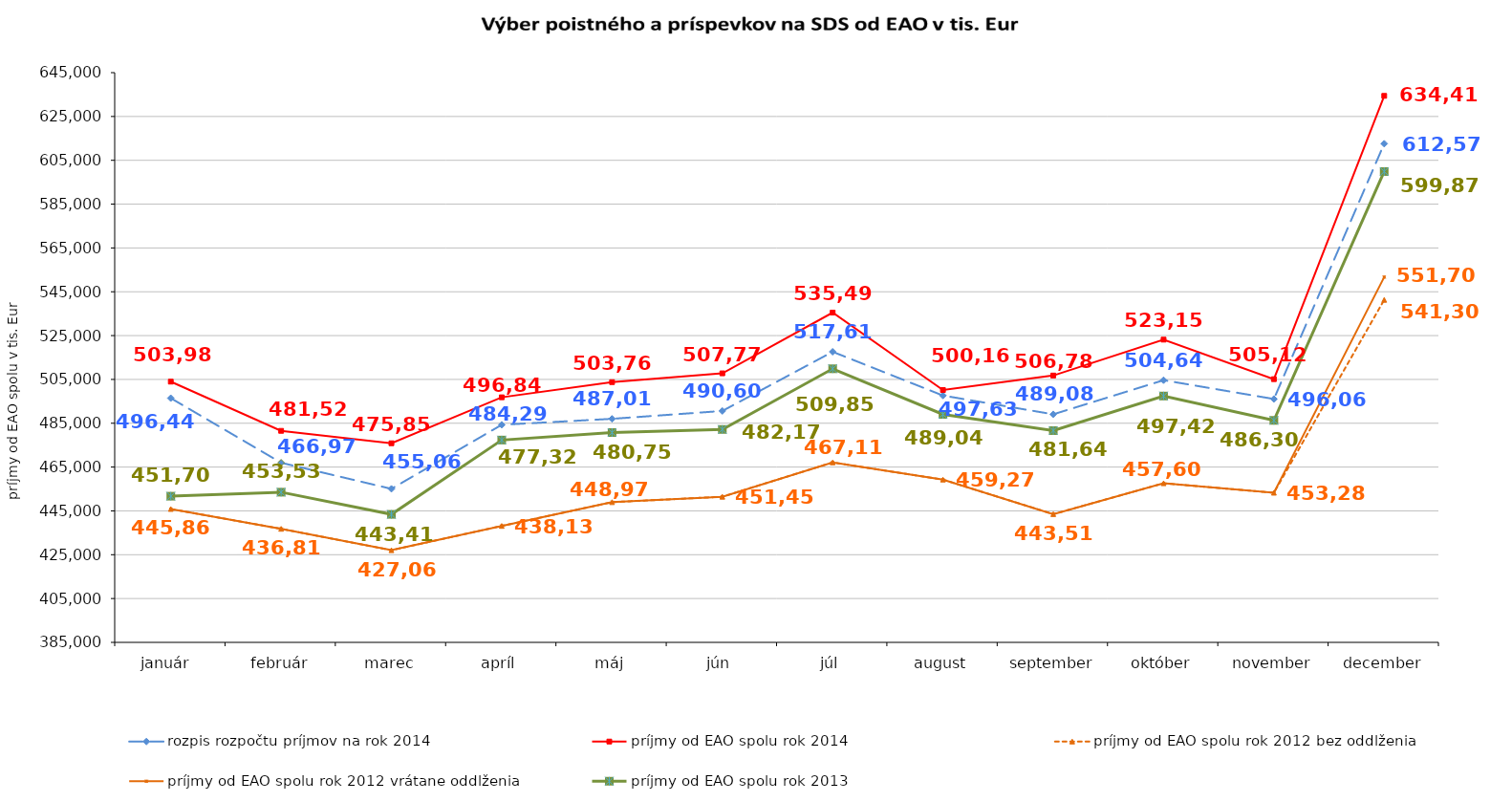
| Category | rozpis rozpočtu príjmov na rok 2014 | príjmy od EAO spolu rok 2014 | príjmy od EAO spolu rok 2012 bez oddlženia | príjmy od EAO spolu rok 2012 vrátane oddlženia | príjmy od EAO spolu rok 2013 |
|---|---|---|---|---|---|
| január  | 496445.438 | 503984 | 445863 | 445863 | 451707 |
| február | 466970.656 | 481528 | 436816 | 436816 | 453534 |
| marec | 455065.226 | 475858 | 427059.557 | 427059.557 | 443416 |
| apríl | 484292.895 | 496840 | 438139.443 | 438139.443 | 477329 |
| máj | 487018.398 | 503765 | 448976 | 448976 | 480751 |
| jún | 490600.275 | 507774 | 451458 | 451458 | 482171 |
| júl | 517613.584 | 535491 | 467118.808 | 467118.808 | 509858 |
| august | 497637.534 | 500166 | 459276 | 459276 | 489040 |
| september | 489084.142 | 506783 | 443517 | 443517 | 481644 |
| október | 504642.737 | 523153 | 457603 | 457603 | 497426 |
| november | 496064.535 | 505122 | 453280 | 453280 | 486306 |
| december | 612569.666 | 634410 | 541304 | 551704 | 599870 |